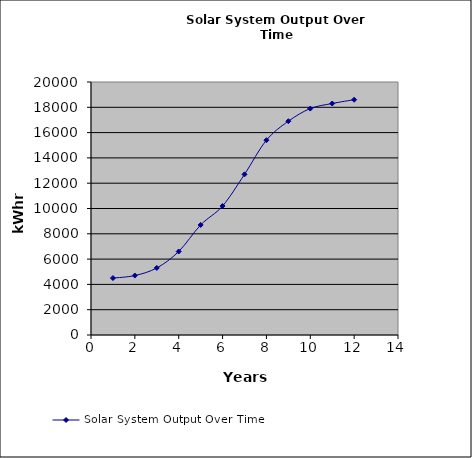
| Category | Solar System Output Over Time |
|---|---|
| 1.0 | 4500 |
| 2.0 | 4700 |
| 3.0 | 5300 |
| 4.0 | 6600 |
| 5.0 | 8700 |
| 6.0 | 10200 |
| 7.0 | 12700 |
| 8.0 | 15400 |
| 9.0 | 16900 |
| 10.0 | 17900 |
| 11.0 | 18300 |
| 12.0 | 18600 |